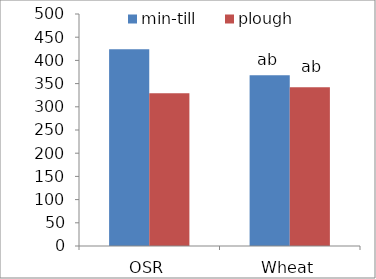
| Category | min-till | plough |
|---|---|---|
| OSR | 424.1 | 329.2 |
| Wheat | 368.2 | 342.4 |